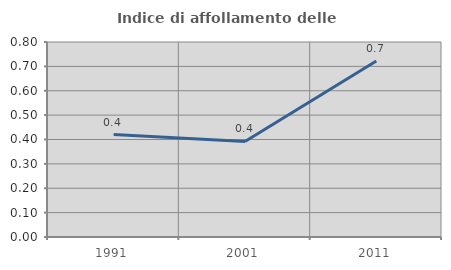
| Category | Indice di affollamento delle abitazioni  |
|---|---|
| 1991.0 | 0.42 |
| 2001.0 | 0.392 |
| 2011.0 | 0.722 |